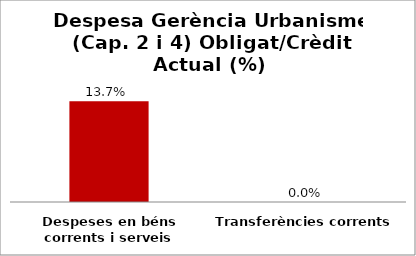
| Category | Series 0 |
|---|---|
| Despeses en béns corrents i serveis | 0.137 |
| Transferències corrents | 0 |